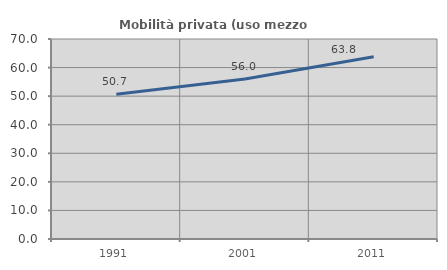
| Category | Mobilità privata (uso mezzo privato) |
|---|---|
| 1991.0 | 50.658 |
| 2001.0 | 56 |
| 2011.0 | 63.78 |